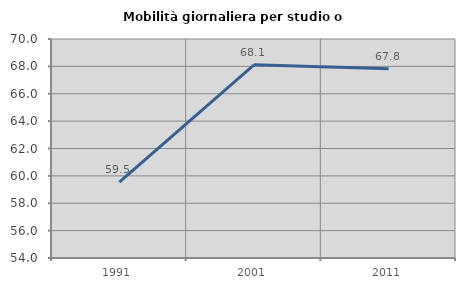
| Category | Mobilità giornaliera per studio o lavoro |
|---|---|
| 1991.0 | 59.548 |
| 2001.0 | 68.117 |
| 2011.0 | 67.822 |